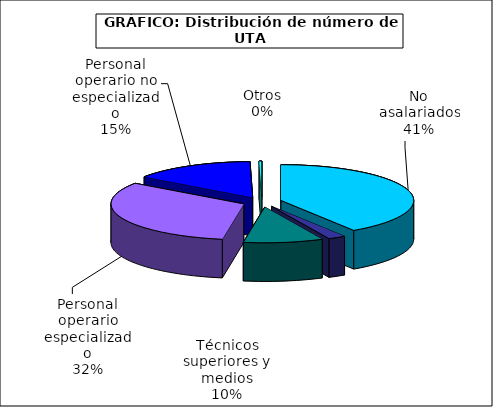
| Category | Series 0 |
|---|---|
| No asalariados | 2742.836 |
| Administrativos | 143.441 |
| Técnicos superiores y medios | 652.868 |
| Personal operario especializado | 2165.232 |
| Personal operario no especializado | 1003.662 |
| Otros | 21.736 |